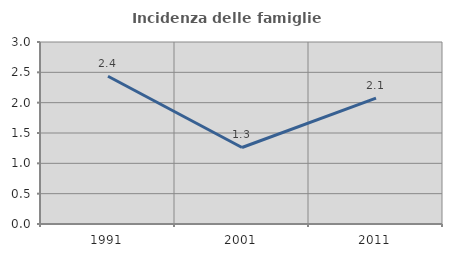
| Category | Incidenza delle famiglie numerose |
|---|---|
| 1991.0 | 2.435 |
| 2001.0 | 1.261 |
| 2011.0 | 2.075 |